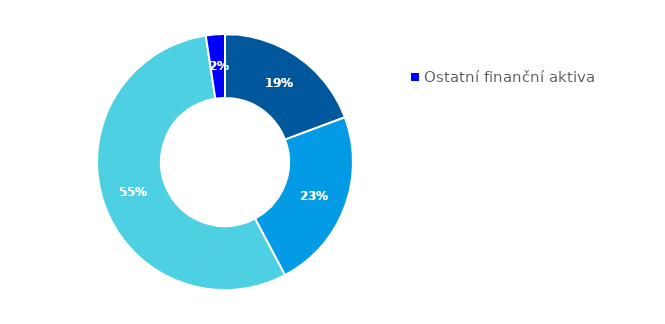
| Category | Series 0 |
|---|---|
| Hotovost | 0.193 |
| Půjčky poskytnuté nemovitostní společnosti | 0.229 |
| Majetkové účasti v nemovitostní společnosti | 0.554 |
| Ostatní finanční aktiva | 0.024 |